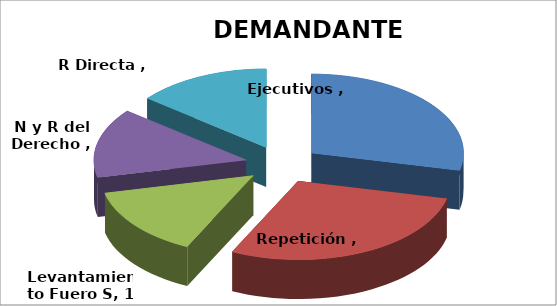
| Category | Series 0 |
|---|---|
| Ejecutivos  | 2 |
| Repetición  | 2 |
| Levantamiento Fuero S | 1 |
| N y R del Derecho  | 1 |
| R Directa  | 1 |